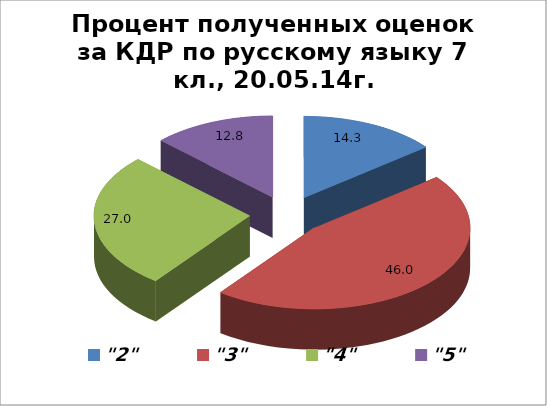
| Category | Series 0 |
|---|---|
| "2" | 14.318 |
| "3" | 45.973 |
| "4" | 26.957 |
| "5" | 12.752 |